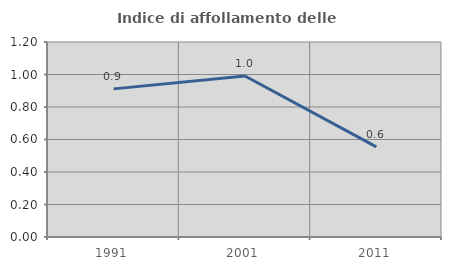
| Category | Indice di affollamento delle abitazioni  |
|---|---|
| 1991.0 | 0.912 |
| 2001.0 | 0.991 |
| 2011.0 | 0.555 |